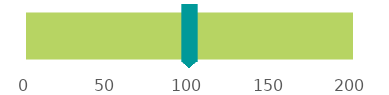
| Category | Series 0 | Measure | Identification of Alcohol and Other Drug Services |
|---|---|---|---|
| 0 |  | 0 | 200 |